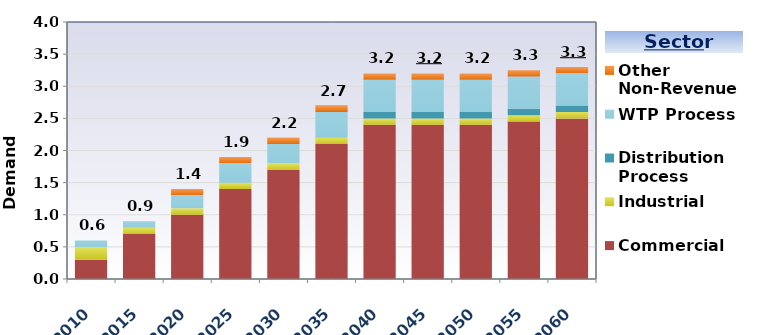
| Category | Commercial | Industrial | Distribution Process | WTP Process | Other Non-Revenue |
|---|---|---|---|---|---|
| 2010.0 | 0.3 | 0.2 | 0 | 0.1 | 0 |
| 2015.0 | 0.7 | 0.1 | 0 | 0.1 | 0 |
| 2020.0 | 1 | 0.1 | 0 | 0.2 | 0.1 |
| 2025.0 | 1.4 | 0.1 | 0 | 0.3 | 0.1 |
| 2030.0 | 1.7 | 0.1 | 0 | 0.3 | 0.1 |
| 2035.0 | 2.1 | 0.1 | 0 | 0.4 | 0.1 |
| 2040.0 | 2.4 | 0.1 | 0.1 | 0.5 | 0.1 |
| 2045.0 | 2.4 | 0.1 | 0.1 | 0.5 | 0.1 |
| 2050.0 | 2.4 | 0.1 | 0.1 | 0.5 | 0.1 |
| 2055.0 | 2.45 | 0.1 | 0.1 | 0.5 | 0.1 |
| 2060.0 | 2.5 | 0.1 | 0.1 | 0.5 | 0.1 |